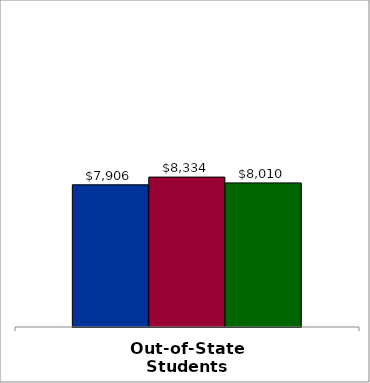
| Category | 50 states and D.C. | SREB states | State |
|---|---|---|---|
| Out-of-State Students | 7906 | 8333.5 | 8010 |